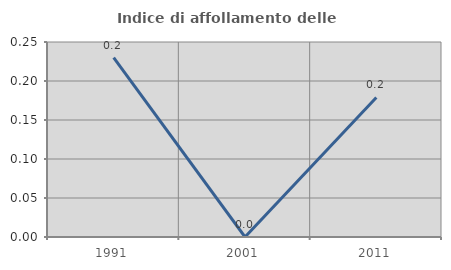
| Category | Indice di affollamento delle abitazioni  |
|---|---|
| 1991.0 | 0.23 |
| 2001.0 | 0 |
| 2011.0 | 0.179 |